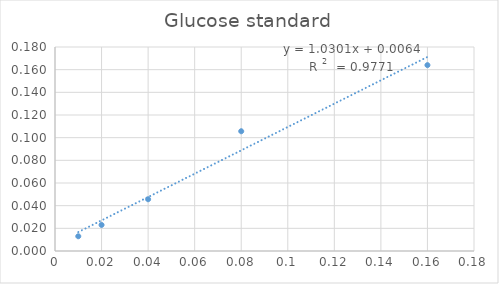
| Category | Series 0 |
|---|---|
| 0.01 | 0.013 |
| 0.02 | 0.023 |
| 0.04 | 0.046 |
| 0.08 | 0.106 |
| 0.16 | 0.164 |